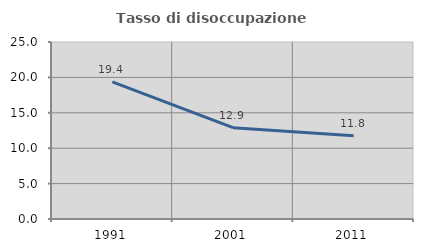
| Category | Tasso di disoccupazione giovanile  |
|---|---|
| 1991.0 | 19.355 |
| 2001.0 | 12.903 |
| 2011.0 | 11.765 |